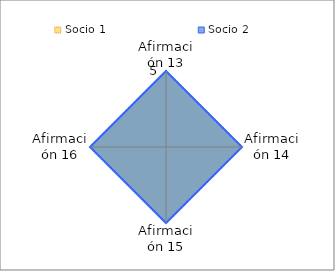
| Category | Socio 1 | Socio 2 |
|---|---|---|
| Afirmación 13 | 5 | 5 |
| Afirmación 14 | 5 | 5 |
| Afirmación 15 | 5 | 5 |
| Afirmación 16 | 5 | 5 |